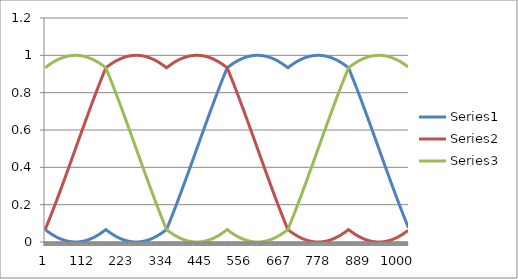
| Category | Series 0 | Series 1 | Series 2 |
|---|---|---|---|
| 0 | 0.067 | 0.067 | 0.933 |
| 1 | 0.065 | 0.072 | 0.935 |
| 2 | 0.064 | 0.076 | 0.936 |
| 3 | 0.062 | 0.081 | 0.938 |
| 4 | 0.061 | 0.086 | 0.939 |
| 5 | 0.06 | 0.09 | 0.94 |
| 6 | 0.058 | 0.095 | 0.942 |
| 7 | 0.057 | 0.1 | 0.943 |
| 8 | 0.055 | 0.104 | 0.945 |
| 9 | 0.054 | 0.109 | 0.946 |
| 10 | 0.052 | 0.114 | 0.948 |
| 11 | 0.051 | 0.119 | 0.949 |
| 12 | 0.05 | 0.123 | 0.95 |
| 13 | 0.048 | 0.128 | 0.952 |
| 14 | 0.047 | 0.133 | 0.953 |
| 15 | 0.046 | 0.138 | 0.954 |
| 16 | 0.045 | 0.143 | 0.955 |
| 17 | 0.043 | 0.147 | 0.957 |
| 18 | 0.042 | 0.152 | 0.958 |
| 19 | 0.041 | 0.157 | 0.959 |
| 20 | 0.04 | 0.162 | 0.96 |
| 21 | 0.038 | 0.167 | 0.962 |
| 22 | 0.037 | 0.172 | 0.963 |
| 23 | 0.036 | 0.177 | 0.964 |
| 24 | 0.035 | 0.182 | 0.965 |
| 25 | 0.034 | 0.187 | 0.966 |
| 26 | 0.033 | 0.192 | 0.967 |
| 27 | 0.032 | 0.197 | 0.968 |
| 28 | 0.031 | 0.202 | 0.969 |
| 29 | 0.03 | 0.207 | 0.97 |
| 30 | 0.029 | 0.212 | 0.971 |
| 31 | 0.028 | 0.217 | 0.972 |
| 32 | 0.027 | 0.222 | 0.973 |
| 33 | 0.026 | 0.227 | 0.974 |
| 34 | 0.025 | 0.232 | 0.975 |
| 35 | 0.024 | 0.237 | 0.976 |
| 36 | 0.023 | 0.242 | 0.977 |
| 37 | 0.022 | 0.247 | 0.978 |
| 38 | 0.021 | 0.252 | 0.979 |
| 39 | 0.02 | 0.257 | 0.98 |
| 40 | 0.019 | 0.262 | 0.981 |
| 41 | 0.018 | 0.267 | 0.982 |
| 42 | 0.018 | 0.272 | 0.982 |
| 43 | 0.017 | 0.278 | 0.983 |
| 44 | 0.016 | 0.283 | 0.984 |
| 45 | 0.015 | 0.288 | 0.985 |
| 46 | 0.014 | 0.293 | 0.986 |
| 47 | 0.014 | 0.298 | 0.986 |
| 48 | 0.013 | 0.303 | 0.987 |
| 49 | 0.012 | 0.309 | 0.988 |
| 50 | 0.012 | 0.314 | 0.988 |
| 51 | 0.011 | 0.319 | 0.989 |
| 52 | 0.01 | 0.324 | 0.99 |
| 53 | 0.01 | 0.329 | 0.99 |
| 54 | 0.009 | 0.335 | 0.991 |
| 55 | 0.009 | 0.34 | 0.991 |
| 56 | 0.008 | 0.345 | 0.992 |
| 57 | 0.008 | 0.35 | 0.992 |
| 58 | 0.007 | 0.355 | 0.993 |
| 59 | 0.007 | 0.361 | 0.993 |
| 60 | 0.006 | 0.366 | 0.994 |
| 61 | 0.006 | 0.371 | 0.994 |
| 62 | 0.005 | 0.376 | 0.995 |
| 63 | 0.005 | 0.382 | 0.995 |
| 64 | 0.004 | 0.387 | 0.996 |
| 65 | 0.004 | 0.392 | 0.996 |
| 66 | 0.004 | 0.398 | 0.996 |
| 67 | 0.003 | 0.403 | 0.997 |
| 68 | 0.003 | 0.408 | 0.997 |
| 69 | 0.003 | 0.413 | 0.997 |
| 70 | 0.002 | 0.419 | 0.998 |
| 71 | 0.002 | 0.424 | 0.998 |
| 72 | 0.002 | 0.429 | 0.998 |
| 73 | 0.001 | 0.435 | 0.999 |
| 74 | 0.001 | 0.44 | 0.999 |
| 75 | 0.001 | 0.445 | 0.999 |
| 76 | 0.001 | 0.45 | 0.999 |
| 77 | 0.001 | 0.456 | 0.999 |
| 78 | 0.001 | 0.461 | 0.999 |
| 79 | 0 | 0.466 | 1 |
| 80 | 0 | 0.472 | 1 |
| 81 | 0 | 0.477 | 1 |
| 82 | 0 | 0.482 | 1 |
| 83 | 0 | 0.488 | 1 |
| 84 | 0 | 0.493 | 1 |
| 85 | 0 | 0.498 | 1 |
| 86 | 0 | 0.504 | 1 |
| 87 | 0 | 0.509 | 1 |
| 88 | 0 | 0.514 | 1 |
| 89 | 0 | 0.519 | 1 |
| 90 | 0 | 0.525 | 1 |
| 91 | 0 | 0.53 | 1 |
| 92 | 0 | 0.535 | 1 |
| 93 | 0.001 | 0.541 | 0.999 |
| 94 | 0.001 | 0.546 | 0.999 |
| 95 | 0.001 | 0.551 | 0.999 |
| 96 | 0.001 | 0.557 | 0.999 |
| 97 | 0.001 | 0.562 | 0.999 |
| 98 | 0.002 | 0.567 | 0.998 |
| 99 | 0.002 | 0.573 | 0.998 |
| 100 | 0.002 | 0.578 | 0.998 |
| 101 | 0.002 | 0.583 | 0.998 |
| 102 | 0.003 | 0.588 | 0.997 |
| 103 | 0.003 | 0.594 | 0.997 |
| 104 | 0.003 | 0.599 | 0.997 |
| 105 | 0.004 | 0.604 | 0.996 |
| 106 | 0.004 | 0.61 | 0.996 |
| 107 | 0.004 | 0.615 | 0.996 |
| 108 | 0.005 | 0.62 | 0.995 |
| 109 | 0.005 | 0.625 | 0.995 |
| 110 | 0.006 | 0.631 | 0.994 |
| 111 | 0.006 | 0.636 | 0.994 |
| 112 | 0.007 | 0.641 | 0.993 |
| 113 | 0.007 | 0.646 | 0.993 |
| 114 | 0.008 | 0.652 | 0.992 |
| 115 | 0.008 | 0.657 | 0.992 |
| 116 | 0.009 | 0.662 | 0.991 |
| 117 | 0.009 | 0.667 | 0.991 |
| 118 | 0.01 | 0.672 | 0.99 |
| 119 | 0.011 | 0.678 | 0.989 |
| 120 | 0.011 | 0.683 | 0.989 |
| 121 | 0.012 | 0.688 | 0.988 |
| 122 | 0.013 | 0.693 | 0.987 |
| 123 | 0.013 | 0.698 | 0.987 |
| 124 | 0.014 | 0.704 | 0.986 |
| 125 | 0.015 | 0.709 | 0.985 |
| 126 | 0.015 | 0.714 | 0.985 |
| 127 | 0.016 | 0.719 | 0.984 |
| 128 | 0.017 | 0.724 | 0.983 |
| 129 | 0.018 | 0.729 | 0.982 |
| 130 | 0.019 | 0.734 | 0.981 |
| 131 | 0.02 | 0.74 | 0.98 |
| 132 | 0.02 | 0.745 | 0.98 |
| 133 | 0.021 | 0.75 | 0.979 |
| 134 | 0.022 | 0.755 | 0.978 |
| 135 | 0.023 | 0.76 | 0.977 |
| 136 | 0.024 | 0.765 | 0.976 |
| 137 | 0.025 | 0.77 | 0.975 |
| 138 | 0.026 | 0.775 | 0.974 |
| 139 | 0.027 | 0.78 | 0.973 |
| 140 | 0.028 | 0.785 | 0.972 |
| 141 | 0.029 | 0.79 | 0.971 |
| 142 | 0.03 | 0.795 | 0.97 |
| 143 | 0.031 | 0.8 | 0.969 |
| 144 | 0.032 | 0.805 | 0.968 |
| 145 | 0.033 | 0.81 | 0.967 |
| 146 | 0.034 | 0.815 | 0.966 |
| 147 | 0.035 | 0.82 | 0.965 |
| 148 | 0.037 | 0.825 | 0.963 |
| 149 | 0.038 | 0.83 | 0.962 |
| 150 | 0.039 | 0.835 | 0.961 |
| 151 | 0.04 | 0.84 | 0.96 |
| 152 | 0.041 | 0.844 | 0.959 |
| 153 | 0.042 | 0.849 | 0.958 |
| 154 | 0.044 | 0.854 | 0.956 |
| 155 | 0.045 | 0.859 | 0.955 |
| 156 | 0.046 | 0.864 | 0.954 |
| 157 | 0.048 | 0.869 | 0.952 |
| 158 | 0.049 | 0.873 | 0.951 |
| 159 | 0.05 | 0.878 | 0.95 |
| 160 | 0.052 | 0.883 | 0.948 |
| 161 | 0.053 | 0.888 | 0.947 |
| 162 | 0.054 | 0.893 | 0.946 |
| 163 | 0.056 | 0.897 | 0.944 |
| 164 | 0.057 | 0.902 | 0.943 |
| 165 | 0.059 | 0.907 | 0.941 |
| 166 | 0.06 | 0.911 | 0.94 |
| 167 | 0.061 | 0.916 | 0.939 |
| 168 | 0.063 | 0.921 | 0.937 |
| 169 | 0.064 | 0.925 | 0.936 |
| 170 | 0.066 | 0.93 | 0.934 |
| 171 | 0.066 | 0.934 | 0.931 |
| 172 | 0.065 | 0.935 | 0.927 |
| 173 | 0.063 | 0.937 | 0.922 |
| 174 | 0.062 | 0.938 | 0.918 |
| 175 | 0.06 | 0.94 | 0.913 |
| 176 | 0.059 | 0.941 | 0.908 |
| 177 | 0.058 | 0.942 | 0.904 |
| 178 | 0.056 | 0.944 | 0.899 |
| 179 | 0.055 | 0.945 | 0.894 |
| 180 | 0.053 | 0.947 | 0.889 |
| 181 | 0.052 | 0.948 | 0.885 |
| 182 | 0.051 | 0.949 | 0.88 |
| 183 | 0.049 | 0.951 | 0.875 |
| 184 | 0.048 | 0.952 | 0.87 |
| 185 | 0.047 | 0.953 | 0.865 |
| 186 | 0.045 | 0.955 | 0.861 |
| 187 | 0.044 | 0.956 | 0.856 |
| 188 | 0.043 | 0.957 | 0.851 |
| 189 | 0.042 | 0.958 | 0.846 |
| 190 | 0.04 | 0.96 | 0.841 |
| 191 | 0.039 | 0.961 | 0.836 |
| 192 | 0.038 | 0.962 | 0.831 |
| 193 | 0.037 | 0.963 | 0.826 |
| 194 | 0.036 | 0.964 | 0.822 |
| 195 | 0.035 | 0.965 | 0.817 |
| 196 | 0.034 | 0.966 | 0.812 |
| 197 | 0.032 | 0.968 | 0.807 |
| 198 | 0.031 | 0.969 | 0.802 |
| 199 | 0.03 | 0.97 | 0.797 |
| 200 | 0.029 | 0.971 | 0.792 |
| 201 | 0.028 | 0.972 | 0.787 |
| 202 | 0.027 | 0.973 | 0.782 |
| 203 | 0.026 | 0.974 | 0.777 |
| 204 | 0.025 | 0.975 | 0.772 |
| 205 | 0.024 | 0.976 | 0.767 |
| 206 | 0.023 | 0.977 | 0.762 |
| 207 | 0.022 | 0.978 | 0.756 |
| 208 | 0.022 | 0.978 | 0.751 |
| 209 | 0.021 | 0.979 | 0.746 |
| 210 | 0.02 | 0.98 | 0.741 |
| 211 | 0.019 | 0.981 | 0.736 |
| 212 | 0.018 | 0.982 | 0.731 |
| 213 | 0.017 | 0.983 | 0.726 |
| 214 | 0.017 | 0.983 | 0.721 |
| 215 | 0.016 | 0.984 | 0.716 |
| 216 | 0.015 | 0.985 | 0.71 |
| 217 | 0.014 | 0.986 | 0.705 |
| 218 | 0.014 | 0.986 | 0.7 |
| 219 | 0.013 | 0.987 | 0.695 |
| 220 | 0.012 | 0.988 | 0.69 |
| 221 | 0.011 | 0.989 | 0.685 |
| 222 | 0.011 | 0.989 | 0.679 |
| 223 | 0.01 | 0.99 | 0.674 |
| 224 | 0.01 | 0.99 | 0.669 |
| 225 | 0.009 | 0.991 | 0.664 |
| 226 | 0.008 | 0.992 | 0.659 |
| 227 | 0.008 | 0.992 | 0.653 |
| 228 | 0.007 | 0.993 | 0.648 |
| 229 | 0.007 | 0.993 | 0.643 |
| 230 | 0.006 | 0.994 | 0.638 |
| 231 | 0.006 | 0.994 | 0.632 |
| 232 | 0.005 | 0.995 | 0.627 |
| 233 | 0.005 | 0.995 | 0.622 |
| 234 | 0.005 | 0.995 | 0.617 |
| 235 | 0.004 | 0.996 | 0.611 |
| 236 | 0.004 | 0.996 | 0.606 |
| 237 | 0.003 | 0.997 | 0.601 |
| 238 | 0.003 | 0.997 | 0.595 |
| 239 | 0.003 | 0.997 | 0.59 |
| 240 | 0.002 | 0.998 | 0.585 |
| 241 | 0.002 | 0.998 | 0.58 |
| 242 | 0.002 | 0.998 | 0.574 |
| 243 | 0.002 | 0.998 | 0.569 |
| 244 | 0.001 | 0.999 | 0.564 |
| 245 | 0.001 | 0.999 | 0.558 |
| 246 | 0.001 | 0.999 | 0.553 |
| 247 | 0.001 | 0.999 | 0.548 |
| 248 | 0.001 | 0.999 | 0.542 |
| 249 | 0 | 1 | 0.537 |
| 250 | 0 | 1 | 0.532 |
| 251 | 0 | 1 | 0.527 |
| 252 | 0 | 1 | 0.521 |
| 253 | 0 | 1 | 0.516 |
| 254 | 0 | 1 | 0.511 |
| 255 | 0 | 1 | 0.505 |
| 256 | 0 | 1 | 0.5 |
| 257 | 0 | 1 | 0.495 |
| 258 | 0 | 1 | 0.489 |
| 259 | 0 | 1 | 0.484 |
| 260 | 0 | 1 | 0.479 |
| 261 | 0 | 1 | 0.473 |
| 262 | 0 | 1 | 0.468 |
| 263 | 0 | 1 | 0.463 |
| 264 | 0.001 | 0.999 | 0.458 |
| 265 | 0.001 | 0.999 | 0.452 |
| 266 | 0.001 | 0.999 | 0.447 |
| 267 | 0.001 | 0.999 | 0.442 |
| 268 | 0.001 | 0.999 | 0.436 |
| 269 | 0.002 | 0.998 | 0.431 |
| 270 | 0.002 | 0.998 | 0.426 |
| 271 | 0.002 | 0.998 | 0.42 |
| 272 | 0.002 | 0.998 | 0.415 |
| 273 | 0.003 | 0.997 | 0.41 |
| 274 | 0.003 | 0.997 | 0.405 |
| 275 | 0.003 | 0.997 | 0.399 |
| 276 | 0.004 | 0.996 | 0.394 |
| 277 | 0.004 | 0.996 | 0.389 |
| 278 | 0.005 | 0.995 | 0.383 |
| 279 | 0.005 | 0.995 | 0.378 |
| 280 | 0.005 | 0.995 | 0.373 |
| 281 | 0.006 | 0.994 | 0.368 |
| 282 | 0.006 | 0.994 | 0.362 |
| 283 | 0.007 | 0.993 | 0.357 |
| 284 | 0.007 | 0.993 | 0.352 |
| 285 | 0.008 | 0.992 | 0.347 |
| 286 | 0.008 | 0.992 | 0.341 |
| 287 | 0.009 | 0.991 | 0.336 |
| 288 | 0.01 | 0.99 | 0.331 |
| 289 | 0.01 | 0.99 | 0.326 |
| 290 | 0.011 | 0.989 | 0.321 |
| 291 | 0.011 | 0.989 | 0.315 |
| 292 | 0.012 | 0.988 | 0.31 |
| 293 | 0.013 | 0.987 | 0.305 |
| 294 | 0.014 | 0.986 | 0.3 |
| 295 | 0.014 | 0.986 | 0.295 |
| 296 | 0.015 | 0.985 | 0.29 |
| 297 | 0.016 | 0.984 | 0.284 |
| 298 | 0.017 | 0.983 | 0.279 |
| 299 | 0.017 | 0.983 | 0.274 |
| 300 | 0.018 | 0.982 | 0.269 |
| 301 | 0.019 | 0.981 | 0.264 |
| 302 | 0.02 | 0.98 | 0.259 |
| 303 | 0.021 | 0.979 | 0.254 |
| 304 | 0.022 | 0.978 | 0.249 |
| 305 | 0.022 | 0.978 | 0.244 |
| 306 | 0.023 | 0.977 | 0.238 |
| 307 | 0.024 | 0.976 | 0.233 |
| 308 | 0.025 | 0.975 | 0.228 |
| 309 | 0.026 | 0.974 | 0.223 |
| 310 | 0.027 | 0.973 | 0.218 |
| 311 | 0.028 | 0.972 | 0.213 |
| 312 | 0.029 | 0.971 | 0.208 |
| 313 | 0.03 | 0.97 | 0.203 |
| 314 | 0.031 | 0.969 | 0.198 |
| 315 | 0.032 | 0.968 | 0.193 |
| 316 | 0.034 | 0.966 | 0.188 |
| 317 | 0.035 | 0.965 | 0.183 |
| 318 | 0.036 | 0.964 | 0.178 |
| 319 | 0.037 | 0.963 | 0.174 |
| 320 | 0.038 | 0.962 | 0.169 |
| 321 | 0.039 | 0.961 | 0.164 |
| 322 | 0.04 | 0.96 | 0.159 |
| 323 | 0.042 | 0.958 | 0.154 |
| 324 | 0.043 | 0.957 | 0.149 |
| 325 | 0.044 | 0.956 | 0.144 |
| 326 | 0.045 | 0.955 | 0.139 |
| 327 | 0.047 | 0.953 | 0.135 |
| 328 | 0.048 | 0.952 | 0.13 |
| 329 | 0.049 | 0.951 | 0.125 |
| 330 | 0.051 | 0.949 | 0.12 |
| 331 | 0.052 | 0.948 | 0.115 |
| 332 | 0.053 | 0.947 | 0.111 |
| 333 | 0.055 | 0.945 | 0.106 |
| 334 | 0.056 | 0.944 | 0.101 |
| 335 | 0.058 | 0.942 | 0.096 |
| 336 | 0.059 | 0.941 | 0.092 |
| 337 | 0.06 | 0.94 | 0.087 |
| 338 | 0.062 | 0.938 | 0.082 |
| 339 | 0.063 | 0.937 | 0.078 |
| 340 | 0.065 | 0.935 | 0.073 |
| 341 | 0.066 | 0.934 | 0.069 |
| 342 | 0.07 | 0.934 | 0.066 |
| 343 | 0.075 | 0.936 | 0.064 |
| 344 | 0.079 | 0.937 | 0.063 |
| 345 | 0.084 | 0.939 | 0.061 |
| 346 | 0.089 | 0.94 | 0.06 |
| 347 | 0.093 | 0.941 | 0.059 |
| 348 | 0.098 | 0.943 | 0.057 |
| 349 | 0.103 | 0.944 | 0.056 |
| 350 | 0.107 | 0.946 | 0.054 |
| 351 | 0.112 | 0.947 | 0.053 |
| 352 | 0.117 | 0.948 | 0.052 |
| 353 | 0.122 | 0.95 | 0.05 |
| 354 | 0.127 | 0.951 | 0.049 |
| 355 | 0.131 | 0.952 | 0.048 |
| 356 | 0.136 | 0.954 | 0.046 |
| 357 | 0.141 | 0.955 | 0.045 |
| 358 | 0.146 | 0.956 | 0.044 |
| 359 | 0.151 | 0.958 | 0.042 |
| 360 | 0.156 | 0.959 | 0.041 |
| 361 | 0.16 | 0.96 | 0.04 |
| 362 | 0.165 | 0.961 | 0.039 |
| 363 | 0.17 | 0.962 | 0.038 |
| 364 | 0.175 | 0.963 | 0.037 |
| 365 | 0.18 | 0.965 | 0.035 |
| 366 | 0.185 | 0.966 | 0.034 |
| 367 | 0.19 | 0.967 | 0.033 |
| 368 | 0.195 | 0.968 | 0.032 |
| 369 | 0.2 | 0.969 | 0.031 |
| 370 | 0.205 | 0.97 | 0.03 |
| 371 | 0.21 | 0.971 | 0.029 |
| 372 | 0.215 | 0.972 | 0.028 |
| 373 | 0.22 | 0.973 | 0.027 |
| 374 | 0.225 | 0.974 | 0.026 |
| 375 | 0.23 | 0.975 | 0.025 |
| 376 | 0.235 | 0.976 | 0.024 |
| 377 | 0.24 | 0.977 | 0.023 |
| 378 | 0.245 | 0.978 | 0.022 |
| 379 | 0.25 | 0.979 | 0.021 |
| 380 | 0.255 | 0.98 | 0.02 |
| 381 | 0.26 | 0.98 | 0.02 |
| 382 | 0.266 | 0.981 | 0.019 |
| 383 | 0.271 | 0.982 | 0.018 |
| 384 | 0.276 | 0.983 | 0.017 |
| 385 | 0.281 | 0.984 | 0.016 |
| 386 | 0.286 | 0.985 | 0.015 |
| 387 | 0.291 | 0.985 | 0.015 |
| 388 | 0.296 | 0.986 | 0.014 |
| 389 | 0.302 | 0.987 | 0.013 |
| 390 | 0.307 | 0.987 | 0.013 |
| 391 | 0.312 | 0.988 | 0.012 |
| 392 | 0.317 | 0.989 | 0.011 |
| 393 | 0.322 | 0.989 | 0.011 |
| 394 | 0.328 | 0.99 | 0.01 |
| 395 | 0.333 | 0.991 | 0.009 |
| 396 | 0.338 | 0.991 | 0.009 |
| 397 | 0.343 | 0.992 | 0.008 |
| 398 | 0.348 | 0.992 | 0.008 |
| 399 | 0.354 | 0.993 | 0.007 |
| 400 | 0.359 | 0.993 | 0.007 |
| 401 | 0.364 | 0.994 | 0.006 |
| 402 | 0.369 | 0.994 | 0.006 |
| 403 | 0.375 | 0.995 | 0.005 |
| 404 | 0.38 | 0.995 | 0.005 |
| 405 | 0.385 | 0.996 | 0.004 |
| 406 | 0.39 | 0.996 | 0.004 |
| 407 | 0.396 | 0.996 | 0.004 |
| 408 | 0.401 | 0.997 | 0.003 |
| 409 | 0.406 | 0.997 | 0.003 |
| 410 | 0.412 | 0.997 | 0.003 |
| 411 | 0.417 | 0.998 | 0.002 |
| 412 | 0.422 | 0.998 | 0.002 |
| 413 | 0.427 | 0.998 | 0.002 |
| 414 | 0.433 | 0.998 | 0.002 |
| 415 | 0.438 | 0.999 | 0.001 |
| 416 | 0.443 | 0.999 | 0.001 |
| 417 | 0.449 | 0.999 | 0.001 |
| 418 | 0.454 | 0.999 | 0.001 |
| 419 | 0.459 | 0.999 | 0.001 |
| 420 | 0.465 | 1 | 0 |
| 421 | 0.47 | 1 | 0 |
| 422 | 0.475 | 1 | 0 |
| 423 | 0.481 | 1 | 0 |
| 424 | 0.486 | 1 | 0 |
| 425 | 0.491 | 1 | 0 |
| 426 | 0.496 | 1 | 0 |
| 427 | 0.502 | 1 | 0 |
| 428 | 0.507 | 1 | 0 |
| 429 | 0.512 | 1 | 0 |
| 430 | 0.518 | 1 | 0 |
| 431 | 0.523 | 1 | 0 |
| 432 | 0.528 | 1 | 0 |
| 433 | 0.534 | 1 | 0 |
| 434 | 0.539 | 0.999 | 0.001 |
| 435 | 0.544 | 0.999 | 0.001 |
| 436 | 0.55 | 0.999 | 0.001 |
| 437 | 0.555 | 0.999 | 0.001 |
| 438 | 0.56 | 0.999 | 0.001 |
| 439 | 0.565 | 0.999 | 0.001 |
| 440 | 0.571 | 0.998 | 0.002 |
| 441 | 0.576 | 0.998 | 0.002 |
| 442 | 0.581 | 0.998 | 0.002 |
| 443 | 0.587 | 0.997 | 0.003 |
| 444 | 0.592 | 0.997 | 0.003 |
| 445 | 0.597 | 0.997 | 0.003 |
| 446 | 0.602 | 0.996 | 0.004 |
| 447 | 0.608 | 0.996 | 0.004 |
| 448 | 0.613 | 0.996 | 0.004 |
| 449 | 0.618 | 0.995 | 0.005 |
| 450 | 0.624 | 0.995 | 0.005 |
| 451 | 0.629 | 0.994 | 0.006 |
| 452 | 0.634 | 0.994 | 0.006 |
| 453 | 0.639 | 0.993 | 0.007 |
| 454 | 0.645 | 0.993 | 0.007 |
| 455 | 0.65 | 0.992 | 0.008 |
| 456 | 0.655 | 0.992 | 0.008 |
| 457 | 0.66 | 0.991 | 0.009 |
| 458 | 0.665 | 0.991 | 0.009 |
| 459 | 0.671 | 0.99 | 0.01 |
| 460 | 0.676 | 0.99 | 0.01 |
| 461 | 0.681 | 0.989 | 0.011 |
| 462 | 0.686 | 0.988 | 0.012 |
| 463 | 0.691 | 0.988 | 0.012 |
| 464 | 0.697 | 0.987 | 0.013 |
| 465 | 0.702 | 0.986 | 0.014 |
| 466 | 0.707 | 0.986 | 0.014 |
| 467 | 0.712 | 0.985 | 0.015 |
| 468 | 0.717 | 0.984 | 0.016 |
| 469 | 0.722 | 0.983 | 0.017 |
| 470 | 0.728 | 0.982 | 0.018 |
| 471 | 0.733 | 0.982 | 0.018 |
| 472 | 0.738 | 0.981 | 0.019 |
| 473 | 0.743 | 0.98 | 0.02 |
| 474 | 0.748 | 0.979 | 0.021 |
| 475 | 0.753 | 0.978 | 0.022 |
| 476 | 0.758 | 0.977 | 0.023 |
| 477 | 0.763 | 0.976 | 0.024 |
| 478 | 0.768 | 0.975 | 0.025 |
| 479 | 0.773 | 0.974 | 0.026 |
| 480 | 0.778 | 0.973 | 0.027 |
| 481 | 0.783 | 0.972 | 0.028 |
| 482 | 0.788 | 0.971 | 0.029 |
| 483 | 0.793 | 0.97 | 0.03 |
| 484 | 0.798 | 0.969 | 0.031 |
| 485 | 0.803 | 0.968 | 0.032 |
| 486 | 0.808 | 0.967 | 0.033 |
| 487 | 0.813 | 0.966 | 0.034 |
| 488 | 0.818 | 0.965 | 0.035 |
| 489 | 0.823 | 0.964 | 0.036 |
| 490 | 0.828 | 0.963 | 0.037 |
| 491 | 0.833 | 0.962 | 0.038 |
| 492 | 0.838 | 0.96 | 0.04 |
| 493 | 0.843 | 0.959 | 0.041 |
| 494 | 0.848 | 0.958 | 0.042 |
| 495 | 0.853 | 0.957 | 0.043 |
| 496 | 0.857 | 0.955 | 0.045 |
| 497 | 0.862 | 0.954 | 0.046 |
| 498 | 0.867 | 0.953 | 0.047 |
| 499 | 0.872 | 0.952 | 0.048 |
| 500 | 0.877 | 0.95 | 0.05 |
| 501 | 0.881 | 0.949 | 0.051 |
| 502 | 0.886 | 0.948 | 0.052 |
| 503 | 0.891 | 0.946 | 0.054 |
| 504 | 0.896 | 0.945 | 0.055 |
| 505 | 0.9 | 0.943 | 0.057 |
| 506 | 0.905 | 0.942 | 0.058 |
| 507 | 0.91 | 0.94 | 0.06 |
| 508 | 0.914 | 0.939 | 0.061 |
| 509 | 0.919 | 0.938 | 0.062 |
| 510 | 0.924 | 0.936 | 0.064 |
| 511 | 0.928 | 0.935 | 0.065 |
| 512 | 0.933 | 0.933 | 0.067 |
| 513 | 0.935 | 0.928 | 0.065 |
| 514 | 0.936 | 0.924 | 0.064 |
| 515 | 0.938 | 0.919 | 0.062 |
| 516 | 0.939 | 0.914 | 0.061 |
| 517 | 0.94 | 0.91 | 0.06 |
| 518 | 0.942 | 0.905 | 0.058 |
| 519 | 0.943 | 0.9 | 0.057 |
| 520 | 0.945 | 0.896 | 0.055 |
| 521 | 0.946 | 0.891 | 0.054 |
| 522 | 0.948 | 0.886 | 0.052 |
| 523 | 0.949 | 0.881 | 0.051 |
| 524 | 0.95 | 0.877 | 0.05 |
| 525 | 0.952 | 0.872 | 0.048 |
| 526 | 0.953 | 0.867 | 0.047 |
| 527 | 0.954 | 0.862 | 0.046 |
| 528 | 0.955 | 0.857 | 0.045 |
| 529 | 0.957 | 0.853 | 0.043 |
| 530 | 0.958 | 0.848 | 0.042 |
| 531 | 0.959 | 0.843 | 0.041 |
| 532 | 0.96 | 0.838 | 0.04 |
| 533 | 0.962 | 0.833 | 0.038 |
| 534 | 0.963 | 0.828 | 0.037 |
| 535 | 0.964 | 0.823 | 0.036 |
| 536 | 0.965 | 0.818 | 0.035 |
| 537 | 0.966 | 0.813 | 0.034 |
| 538 | 0.967 | 0.808 | 0.033 |
| 539 | 0.968 | 0.803 | 0.032 |
| 540 | 0.969 | 0.798 | 0.031 |
| 541 | 0.97 | 0.793 | 0.03 |
| 542 | 0.971 | 0.788 | 0.029 |
| 543 | 0.972 | 0.783 | 0.028 |
| 544 | 0.973 | 0.778 | 0.027 |
| 545 | 0.974 | 0.773 | 0.026 |
| 546 | 0.975 | 0.768 | 0.025 |
| 547 | 0.976 | 0.763 | 0.024 |
| 548 | 0.977 | 0.758 | 0.023 |
| 549 | 0.978 | 0.753 | 0.022 |
| 550 | 0.979 | 0.748 | 0.021 |
| 551 | 0.98 | 0.743 | 0.02 |
| 552 | 0.981 | 0.738 | 0.019 |
| 553 | 0.982 | 0.733 | 0.018 |
| 554 | 0.982 | 0.728 | 0.018 |
| 555 | 0.983 | 0.722 | 0.017 |
| 556 | 0.984 | 0.717 | 0.016 |
| 557 | 0.985 | 0.712 | 0.015 |
| 558 | 0.986 | 0.707 | 0.014 |
| 559 | 0.986 | 0.702 | 0.014 |
| 560 | 0.987 | 0.697 | 0.013 |
| 561 | 0.988 | 0.691 | 0.012 |
| 562 | 0.988 | 0.686 | 0.012 |
| 563 | 0.989 | 0.681 | 0.011 |
| 564 | 0.99 | 0.676 | 0.01 |
| 565 | 0.99 | 0.671 | 0.01 |
| 566 | 0.991 | 0.665 | 0.009 |
| 567 | 0.991 | 0.66 | 0.009 |
| 568 | 0.992 | 0.655 | 0.008 |
| 569 | 0.992 | 0.65 | 0.008 |
| 570 | 0.993 | 0.645 | 0.007 |
| 571 | 0.993 | 0.639 | 0.007 |
| 572 | 0.994 | 0.634 | 0.006 |
| 573 | 0.994 | 0.629 | 0.006 |
| 574 | 0.995 | 0.624 | 0.005 |
| 575 | 0.995 | 0.618 | 0.005 |
| 576 | 0.996 | 0.613 | 0.004 |
| 577 | 0.996 | 0.608 | 0.004 |
| 578 | 0.996 | 0.602 | 0.004 |
| 579 | 0.997 | 0.597 | 0.003 |
| 580 | 0.997 | 0.592 | 0.003 |
| 581 | 0.997 | 0.587 | 0.003 |
| 582 | 0.998 | 0.581 | 0.002 |
| 583 | 0.998 | 0.576 | 0.002 |
| 584 | 0.998 | 0.571 | 0.002 |
| 585 | 0.999 | 0.565 | 0.001 |
| 586 | 0.999 | 0.56 | 0.001 |
| 587 | 0.999 | 0.555 | 0.001 |
| 588 | 0.999 | 0.55 | 0.001 |
| 589 | 0.999 | 0.544 | 0.001 |
| 590 | 0.999 | 0.539 | 0.001 |
| 591 | 1 | 0.534 | 0 |
| 592 | 1 | 0.528 | 0 |
| 593 | 1 | 0.523 | 0 |
| 594 | 1 | 0.518 | 0 |
| 595 | 1 | 0.512 | 0 |
| 596 | 1 | 0.507 | 0 |
| 597 | 1 | 0.502 | 0 |
| 598 | 1 | 0.496 | 0 |
| 599 | 1 | 0.491 | 0 |
| 600 | 1 | 0.486 | 0 |
| 601 | 1 | 0.481 | 0 |
| 602 | 1 | 0.475 | 0 |
| 603 | 1 | 0.47 | 0 |
| 604 | 1 | 0.465 | 0 |
| 605 | 0.999 | 0.459 | 0.001 |
| 606 | 0.999 | 0.454 | 0.001 |
| 607 | 0.999 | 0.449 | 0.001 |
| 608 | 0.999 | 0.443 | 0.001 |
| 609 | 0.999 | 0.438 | 0.001 |
| 610 | 0.998 | 0.433 | 0.002 |
| 611 | 0.998 | 0.427 | 0.002 |
| 612 | 0.998 | 0.422 | 0.002 |
| 613 | 0.998 | 0.417 | 0.002 |
| 614 | 0.997 | 0.412 | 0.003 |
| 615 | 0.997 | 0.406 | 0.003 |
| 616 | 0.997 | 0.401 | 0.003 |
| 617 | 0.996 | 0.396 | 0.004 |
| 618 | 0.996 | 0.39 | 0.004 |
| 619 | 0.996 | 0.385 | 0.004 |
| 620 | 0.995 | 0.38 | 0.005 |
| 621 | 0.995 | 0.375 | 0.005 |
| 622 | 0.994 | 0.369 | 0.006 |
| 623 | 0.994 | 0.364 | 0.006 |
| 624 | 0.993 | 0.359 | 0.007 |
| 625 | 0.993 | 0.354 | 0.007 |
| 626 | 0.992 | 0.348 | 0.008 |
| 627 | 0.992 | 0.343 | 0.008 |
| 628 | 0.991 | 0.338 | 0.009 |
| 629 | 0.991 | 0.333 | 0.009 |
| 630 | 0.99 | 0.328 | 0.01 |
| 631 | 0.989 | 0.322 | 0.011 |
| 632 | 0.989 | 0.317 | 0.011 |
| 633 | 0.988 | 0.312 | 0.012 |
| 634 | 0.987 | 0.307 | 0.013 |
| 635 | 0.987 | 0.302 | 0.013 |
| 636 | 0.986 | 0.296 | 0.014 |
| 637 | 0.985 | 0.291 | 0.015 |
| 638 | 0.985 | 0.286 | 0.015 |
| 639 | 0.984 | 0.281 | 0.016 |
| 640 | 0.983 | 0.276 | 0.017 |
| 641 | 0.982 | 0.271 | 0.018 |
| 642 | 0.981 | 0.266 | 0.019 |
| 643 | 0.98 | 0.26 | 0.02 |
| 644 | 0.98 | 0.255 | 0.02 |
| 645 | 0.979 | 0.25 | 0.021 |
| 646 | 0.978 | 0.245 | 0.022 |
| 647 | 0.977 | 0.24 | 0.023 |
| 648 | 0.976 | 0.235 | 0.024 |
| 649 | 0.975 | 0.23 | 0.025 |
| 650 | 0.974 | 0.225 | 0.026 |
| 651 | 0.973 | 0.22 | 0.027 |
| 652 | 0.972 | 0.215 | 0.028 |
| 653 | 0.971 | 0.21 | 0.029 |
| 654 | 0.97 | 0.205 | 0.03 |
| 655 | 0.969 | 0.2 | 0.031 |
| 656 | 0.968 | 0.195 | 0.032 |
| 657 | 0.967 | 0.19 | 0.033 |
| 658 | 0.966 | 0.185 | 0.034 |
| 659 | 0.965 | 0.18 | 0.035 |
| 660 | 0.963 | 0.175 | 0.037 |
| 661 | 0.962 | 0.17 | 0.038 |
| 662 | 0.961 | 0.165 | 0.039 |
| 663 | 0.96 | 0.16 | 0.04 |
| 664 | 0.959 | 0.156 | 0.041 |
| 665 | 0.958 | 0.151 | 0.042 |
| 666 | 0.956 | 0.146 | 0.044 |
| 667 | 0.955 | 0.141 | 0.045 |
| 668 | 0.954 | 0.136 | 0.046 |
| 669 | 0.952 | 0.131 | 0.048 |
| 670 | 0.951 | 0.127 | 0.049 |
| 671 | 0.95 | 0.122 | 0.05 |
| 672 | 0.948 | 0.117 | 0.052 |
| 673 | 0.947 | 0.112 | 0.053 |
| 674 | 0.946 | 0.107 | 0.054 |
| 675 | 0.944 | 0.103 | 0.056 |
| 676 | 0.943 | 0.098 | 0.057 |
| 677 | 0.941 | 0.093 | 0.059 |
| 678 | 0.94 | 0.089 | 0.06 |
| 679 | 0.939 | 0.084 | 0.061 |
| 680 | 0.937 | 0.079 | 0.063 |
| 681 | 0.936 | 0.075 | 0.064 |
| 682 | 0.934 | 0.07 | 0.066 |
| 683 | 0.934 | 0.066 | 0.069 |
| 684 | 0.935 | 0.065 | 0.073 |
| 685 | 0.937 | 0.063 | 0.078 |
| 686 | 0.938 | 0.062 | 0.082 |
| 687 | 0.94 | 0.06 | 0.087 |
| 688 | 0.941 | 0.059 | 0.092 |
| 689 | 0.942 | 0.058 | 0.096 |
| 690 | 0.944 | 0.056 | 0.101 |
| 691 | 0.945 | 0.055 | 0.106 |
| 692 | 0.947 | 0.053 | 0.111 |
| 693 | 0.948 | 0.052 | 0.115 |
| 694 | 0.949 | 0.051 | 0.12 |
| 695 | 0.951 | 0.049 | 0.125 |
| 696 | 0.952 | 0.048 | 0.13 |
| 697 | 0.953 | 0.047 | 0.135 |
| 698 | 0.955 | 0.045 | 0.139 |
| 699 | 0.956 | 0.044 | 0.144 |
| 700 | 0.957 | 0.043 | 0.149 |
| 701 | 0.958 | 0.042 | 0.154 |
| 702 | 0.96 | 0.04 | 0.159 |
| 703 | 0.961 | 0.039 | 0.164 |
| 704 | 0.962 | 0.038 | 0.169 |
| 705 | 0.963 | 0.037 | 0.174 |
| 706 | 0.964 | 0.036 | 0.178 |
| 707 | 0.965 | 0.035 | 0.183 |
| 708 | 0.966 | 0.034 | 0.188 |
| 709 | 0.968 | 0.032 | 0.193 |
| 710 | 0.969 | 0.031 | 0.198 |
| 711 | 0.97 | 0.03 | 0.203 |
| 712 | 0.971 | 0.029 | 0.208 |
| 713 | 0.972 | 0.028 | 0.213 |
| 714 | 0.973 | 0.027 | 0.218 |
| 715 | 0.974 | 0.026 | 0.223 |
| 716 | 0.975 | 0.025 | 0.228 |
| 717 | 0.976 | 0.024 | 0.233 |
| 718 | 0.977 | 0.023 | 0.238 |
| 719 | 0.978 | 0.022 | 0.244 |
| 720 | 0.978 | 0.022 | 0.249 |
| 721 | 0.979 | 0.021 | 0.254 |
| 722 | 0.98 | 0.02 | 0.259 |
| 723 | 0.981 | 0.019 | 0.264 |
| 724 | 0.982 | 0.018 | 0.269 |
| 725 | 0.983 | 0.017 | 0.274 |
| 726 | 0.983 | 0.017 | 0.279 |
| 727 | 0.984 | 0.016 | 0.284 |
| 728 | 0.985 | 0.015 | 0.29 |
| 729 | 0.986 | 0.014 | 0.295 |
| 730 | 0.986 | 0.014 | 0.3 |
| 731 | 0.987 | 0.013 | 0.305 |
| 732 | 0.988 | 0.012 | 0.31 |
| 733 | 0.989 | 0.011 | 0.315 |
| 734 | 0.989 | 0.011 | 0.321 |
| 735 | 0.99 | 0.01 | 0.326 |
| 736 | 0.99 | 0.01 | 0.331 |
| 737 | 0.991 | 0.009 | 0.336 |
| 738 | 0.992 | 0.008 | 0.341 |
| 739 | 0.992 | 0.008 | 0.347 |
| 740 | 0.993 | 0.007 | 0.352 |
| 741 | 0.993 | 0.007 | 0.357 |
| 742 | 0.994 | 0.006 | 0.362 |
| 743 | 0.994 | 0.006 | 0.368 |
| 744 | 0.995 | 0.005 | 0.373 |
| 745 | 0.995 | 0.005 | 0.378 |
| 746 | 0.995 | 0.005 | 0.383 |
| 747 | 0.996 | 0.004 | 0.389 |
| 748 | 0.996 | 0.004 | 0.394 |
| 749 | 0.997 | 0.003 | 0.399 |
| 750 | 0.997 | 0.003 | 0.405 |
| 751 | 0.997 | 0.003 | 0.41 |
| 752 | 0.998 | 0.002 | 0.415 |
| 753 | 0.998 | 0.002 | 0.42 |
| 754 | 0.998 | 0.002 | 0.426 |
| 755 | 0.998 | 0.002 | 0.431 |
| 756 | 0.999 | 0.001 | 0.436 |
| 757 | 0.999 | 0.001 | 0.442 |
| 758 | 0.999 | 0.001 | 0.447 |
| 759 | 0.999 | 0.001 | 0.452 |
| 760 | 0.999 | 0.001 | 0.458 |
| 761 | 1 | 0 | 0.463 |
| 762 | 1 | 0 | 0.468 |
| 763 | 1 | 0 | 0.473 |
| 764 | 1 | 0 | 0.479 |
| 765 | 1 | 0 | 0.484 |
| 766 | 1 | 0 | 0.489 |
| 767 | 1 | 0 | 0.495 |
| 768 | 1 | 0 | 0.5 |
| 769 | 1 | 0 | 0.505 |
| 770 | 1 | 0 | 0.511 |
| 771 | 1 | 0 | 0.516 |
| 772 | 1 | 0 | 0.521 |
| 773 | 1 | 0 | 0.527 |
| 774 | 1 | 0 | 0.532 |
| 775 | 1 | 0 | 0.537 |
| 776 | 0.999 | 0.001 | 0.542 |
| 777 | 0.999 | 0.001 | 0.548 |
| 778 | 0.999 | 0.001 | 0.553 |
| 779 | 0.999 | 0.001 | 0.558 |
| 780 | 0.999 | 0.001 | 0.564 |
| 781 | 0.998 | 0.002 | 0.569 |
| 782 | 0.998 | 0.002 | 0.574 |
| 783 | 0.998 | 0.002 | 0.58 |
| 784 | 0.998 | 0.002 | 0.585 |
| 785 | 0.997 | 0.003 | 0.59 |
| 786 | 0.997 | 0.003 | 0.595 |
| 787 | 0.997 | 0.003 | 0.601 |
| 788 | 0.996 | 0.004 | 0.606 |
| 789 | 0.996 | 0.004 | 0.611 |
| 790 | 0.995 | 0.005 | 0.617 |
| 791 | 0.995 | 0.005 | 0.622 |
| 792 | 0.995 | 0.005 | 0.627 |
| 793 | 0.994 | 0.006 | 0.632 |
| 794 | 0.994 | 0.006 | 0.638 |
| 795 | 0.993 | 0.007 | 0.643 |
| 796 | 0.993 | 0.007 | 0.648 |
| 797 | 0.992 | 0.008 | 0.653 |
| 798 | 0.992 | 0.008 | 0.659 |
| 799 | 0.991 | 0.009 | 0.664 |
| 800 | 0.99 | 0.01 | 0.669 |
| 801 | 0.99 | 0.01 | 0.674 |
| 802 | 0.989 | 0.011 | 0.679 |
| 803 | 0.989 | 0.011 | 0.685 |
| 804 | 0.988 | 0.012 | 0.69 |
| 805 | 0.987 | 0.013 | 0.695 |
| 806 | 0.986 | 0.014 | 0.7 |
| 807 | 0.986 | 0.014 | 0.705 |
| 808 | 0.985 | 0.015 | 0.71 |
| 809 | 0.984 | 0.016 | 0.716 |
| 810 | 0.983 | 0.017 | 0.721 |
| 811 | 0.983 | 0.017 | 0.726 |
| 812 | 0.982 | 0.018 | 0.731 |
| 813 | 0.981 | 0.019 | 0.736 |
| 814 | 0.98 | 0.02 | 0.741 |
| 815 | 0.979 | 0.021 | 0.746 |
| 816 | 0.978 | 0.022 | 0.751 |
| 817 | 0.978 | 0.022 | 0.756 |
| 818 | 0.977 | 0.023 | 0.762 |
| 819 | 0.976 | 0.024 | 0.767 |
| 820 | 0.975 | 0.025 | 0.772 |
| 821 | 0.974 | 0.026 | 0.777 |
| 822 | 0.973 | 0.027 | 0.782 |
| 823 | 0.972 | 0.028 | 0.787 |
| 824 | 0.971 | 0.029 | 0.792 |
| 825 | 0.97 | 0.03 | 0.797 |
| 826 | 0.969 | 0.031 | 0.802 |
| 827 | 0.968 | 0.032 | 0.807 |
| 828 | 0.966 | 0.034 | 0.812 |
| 829 | 0.965 | 0.035 | 0.817 |
| 830 | 0.964 | 0.036 | 0.822 |
| 831 | 0.963 | 0.037 | 0.826 |
| 832 | 0.962 | 0.038 | 0.831 |
| 833 | 0.961 | 0.039 | 0.836 |
| 834 | 0.96 | 0.04 | 0.841 |
| 835 | 0.958 | 0.042 | 0.846 |
| 836 | 0.957 | 0.043 | 0.851 |
| 837 | 0.956 | 0.044 | 0.856 |
| 838 | 0.955 | 0.045 | 0.861 |
| 839 | 0.953 | 0.047 | 0.865 |
| 840 | 0.952 | 0.048 | 0.87 |
| 841 | 0.951 | 0.049 | 0.875 |
| 842 | 0.949 | 0.051 | 0.88 |
| 843 | 0.948 | 0.052 | 0.885 |
| 844 | 0.947 | 0.053 | 0.889 |
| 845 | 0.945 | 0.055 | 0.894 |
| 846 | 0.944 | 0.056 | 0.899 |
| 847 | 0.942 | 0.058 | 0.904 |
| 848 | 0.941 | 0.059 | 0.908 |
| 849 | 0.94 | 0.06 | 0.913 |
| 850 | 0.938 | 0.062 | 0.918 |
| 851 | 0.937 | 0.063 | 0.922 |
| 852 | 0.935 | 0.065 | 0.927 |
| 853 | 0.934 | 0.066 | 0.931 |
| 854 | 0.93 | 0.066 | 0.934 |
| 855 | 0.925 | 0.064 | 0.936 |
| 856 | 0.921 | 0.063 | 0.937 |
| 857 | 0.916 | 0.061 | 0.939 |
| 858 | 0.911 | 0.06 | 0.94 |
| 859 | 0.907 | 0.059 | 0.941 |
| 860 | 0.902 | 0.057 | 0.943 |
| 861 | 0.897 | 0.056 | 0.944 |
| 862 | 0.893 | 0.054 | 0.946 |
| 863 | 0.888 | 0.053 | 0.947 |
| 864 | 0.883 | 0.052 | 0.948 |
| 865 | 0.878 | 0.05 | 0.95 |
| 866 | 0.873 | 0.049 | 0.951 |
| 867 | 0.869 | 0.048 | 0.952 |
| 868 | 0.864 | 0.046 | 0.954 |
| 869 | 0.859 | 0.045 | 0.955 |
| 870 | 0.854 | 0.044 | 0.956 |
| 871 | 0.849 | 0.042 | 0.958 |
| 872 | 0.844 | 0.041 | 0.959 |
| 873 | 0.84 | 0.04 | 0.96 |
| 874 | 0.835 | 0.039 | 0.961 |
| 875 | 0.83 | 0.038 | 0.962 |
| 876 | 0.825 | 0.037 | 0.963 |
| 877 | 0.82 | 0.035 | 0.965 |
| 878 | 0.815 | 0.034 | 0.966 |
| 879 | 0.81 | 0.033 | 0.967 |
| 880 | 0.805 | 0.032 | 0.968 |
| 881 | 0.8 | 0.031 | 0.969 |
| 882 | 0.795 | 0.03 | 0.97 |
| 883 | 0.79 | 0.029 | 0.971 |
| 884 | 0.785 | 0.028 | 0.972 |
| 885 | 0.78 | 0.027 | 0.973 |
| 886 | 0.775 | 0.026 | 0.974 |
| 887 | 0.77 | 0.025 | 0.975 |
| 888 | 0.765 | 0.024 | 0.976 |
| 889 | 0.76 | 0.023 | 0.977 |
| 890 | 0.755 | 0.022 | 0.978 |
| 891 | 0.75 | 0.021 | 0.979 |
| 892 | 0.745 | 0.02 | 0.98 |
| 893 | 0.74 | 0.02 | 0.98 |
| 894 | 0.734 | 0.019 | 0.981 |
| 895 | 0.729 | 0.018 | 0.982 |
| 896 | 0.724 | 0.017 | 0.983 |
| 897 | 0.719 | 0.016 | 0.984 |
| 898 | 0.714 | 0.015 | 0.985 |
| 899 | 0.709 | 0.015 | 0.985 |
| 900 | 0.704 | 0.014 | 0.986 |
| 901 | 0.698 | 0.013 | 0.987 |
| 902 | 0.693 | 0.013 | 0.987 |
| 903 | 0.688 | 0.012 | 0.988 |
| 904 | 0.683 | 0.011 | 0.989 |
| 905 | 0.678 | 0.011 | 0.989 |
| 906 | 0.672 | 0.01 | 0.99 |
| 907 | 0.667 | 0.009 | 0.991 |
| 908 | 0.662 | 0.009 | 0.991 |
| 909 | 0.657 | 0.008 | 0.992 |
| 910 | 0.652 | 0.008 | 0.992 |
| 911 | 0.646 | 0.007 | 0.993 |
| 912 | 0.641 | 0.007 | 0.993 |
| 913 | 0.636 | 0.006 | 0.994 |
| 914 | 0.631 | 0.006 | 0.994 |
| 915 | 0.625 | 0.005 | 0.995 |
| 916 | 0.62 | 0.005 | 0.995 |
| 917 | 0.615 | 0.004 | 0.996 |
| 918 | 0.61 | 0.004 | 0.996 |
| 919 | 0.604 | 0.004 | 0.996 |
| 920 | 0.599 | 0.003 | 0.997 |
| 921 | 0.594 | 0.003 | 0.997 |
| 922 | 0.588 | 0.003 | 0.997 |
| 923 | 0.583 | 0.002 | 0.998 |
| 924 | 0.578 | 0.002 | 0.998 |
| 925 | 0.573 | 0.002 | 0.998 |
| 926 | 0.567 | 0.002 | 0.998 |
| 927 | 0.562 | 0.001 | 0.999 |
| 928 | 0.557 | 0.001 | 0.999 |
| 929 | 0.551 | 0.001 | 0.999 |
| 930 | 0.546 | 0.001 | 0.999 |
| 931 | 0.541 | 0.001 | 0.999 |
| 932 | 0.535 | 0 | 1 |
| 933 | 0.53 | 0 | 1 |
| 934 | 0.525 | 0 | 1 |
| 935 | 0.519 | 0 | 1 |
| 936 | 0.514 | 0 | 1 |
| 937 | 0.509 | 0 | 1 |
| 938 | 0.504 | 0 | 1 |
| 939 | 0.498 | 0 | 1 |
| 940 | 0.493 | 0 | 1 |
| 941 | 0.488 | 0 | 1 |
| 942 | 0.482 | 0 | 1 |
| 943 | 0.477 | 0 | 1 |
| 944 | 0.472 | 0 | 1 |
| 945 | 0.466 | 0 | 1 |
| 946 | 0.461 | 0.001 | 0.999 |
| 947 | 0.456 | 0.001 | 0.999 |
| 948 | 0.45 | 0.001 | 0.999 |
| 949 | 0.445 | 0.001 | 0.999 |
| 950 | 0.44 | 0.001 | 0.999 |
| 951 | 0.435 | 0.001 | 0.999 |
| 952 | 0.429 | 0.002 | 0.998 |
| 953 | 0.424 | 0.002 | 0.998 |
| 954 | 0.419 | 0.002 | 0.998 |
| 955 | 0.413 | 0.003 | 0.997 |
| 956 | 0.408 | 0.003 | 0.997 |
| 957 | 0.403 | 0.003 | 0.997 |
| 958 | 0.398 | 0.004 | 0.996 |
| 959 | 0.392 | 0.004 | 0.996 |
| 960 | 0.387 | 0.004 | 0.996 |
| 961 | 0.382 | 0.005 | 0.995 |
| 962 | 0.376 | 0.005 | 0.995 |
| 963 | 0.371 | 0.006 | 0.994 |
| 964 | 0.366 | 0.006 | 0.994 |
| 965 | 0.361 | 0.007 | 0.993 |
| 966 | 0.355 | 0.007 | 0.993 |
| 967 | 0.35 | 0.008 | 0.992 |
| 968 | 0.345 | 0.008 | 0.992 |
| 969 | 0.34 | 0.009 | 0.991 |
| 970 | 0.335 | 0.009 | 0.991 |
| 971 | 0.329 | 0.01 | 0.99 |
| 972 | 0.324 | 0.01 | 0.99 |
| 973 | 0.319 | 0.011 | 0.989 |
| 974 | 0.314 | 0.012 | 0.988 |
| 975 | 0.309 | 0.012 | 0.988 |
| 976 | 0.303 | 0.013 | 0.987 |
| 977 | 0.298 | 0.014 | 0.986 |
| 978 | 0.293 | 0.014 | 0.986 |
| 979 | 0.288 | 0.015 | 0.985 |
| 980 | 0.283 | 0.016 | 0.984 |
| 981 | 0.278 | 0.017 | 0.983 |
| 982 | 0.272 | 0.018 | 0.982 |
| 983 | 0.267 | 0.018 | 0.982 |
| 984 | 0.262 | 0.019 | 0.981 |
| 985 | 0.257 | 0.02 | 0.98 |
| 986 | 0.252 | 0.021 | 0.979 |
| 987 | 0.247 | 0.022 | 0.978 |
| 988 | 0.242 | 0.023 | 0.977 |
| 989 | 0.237 | 0.024 | 0.976 |
| 990 | 0.232 | 0.025 | 0.975 |
| 991 | 0.227 | 0.026 | 0.974 |
| 992 | 0.222 | 0.027 | 0.973 |
| 993 | 0.217 | 0.028 | 0.972 |
| 994 | 0.212 | 0.029 | 0.971 |
| 995 | 0.207 | 0.03 | 0.97 |
| 996 | 0.202 | 0.031 | 0.969 |
| 997 | 0.197 | 0.032 | 0.968 |
| 998 | 0.192 | 0.033 | 0.967 |
| 999 | 0.187 | 0.034 | 0.966 |
| 1000 | 0.182 | 0.035 | 0.965 |
| 1001 | 0.177 | 0.036 | 0.964 |
| 1002 | 0.172 | 0.037 | 0.963 |
| 1003 | 0.167 | 0.038 | 0.962 |
| 1004 | 0.162 | 0.04 | 0.96 |
| 1005 | 0.157 | 0.041 | 0.959 |
| 1006 | 0.152 | 0.042 | 0.958 |
| 1007 | 0.147 | 0.043 | 0.957 |
| 1008 | 0.143 | 0.045 | 0.955 |
| 1009 | 0.138 | 0.046 | 0.954 |
| 1010 | 0.133 | 0.047 | 0.953 |
| 1011 | 0.128 | 0.048 | 0.952 |
| 1012 | 0.123 | 0.05 | 0.95 |
| 1013 | 0.119 | 0.051 | 0.949 |
| 1014 | 0.114 | 0.052 | 0.948 |
| 1015 | 0.109 | 0.054 | 0.946 |
| 1016 | 0.104 | 0.055 | 0.945 |
| 1017 | 0.1 | 0.057 | 0.943 |
| 1018 | 0.095 | 0.058 | 0.942 |
| 1019 | 0.09 | 0.06 | 0.94 |
| 1020 | 0.086 | 0.061 | 0.939 |
| 1021 | 0.081 | 0.062 | 0.938 |
| 1022 | 0.076 | 0.064 | 0.936 |
| 1023 | 0.072 | 0.065 | 0.935 |